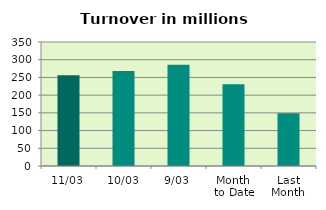
| Category | Series 0 |
|---|---|
| 11/03 | 256 |
| 10/03 | 268.248 |
| 9/03 | 285.876 |
| Month 
to Date | 230.764 |
| Last
Month | 148.578 |